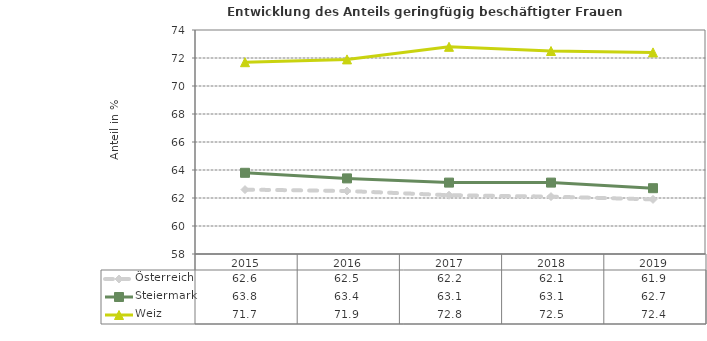
| Category | Österreich | Steiermark | Weiz |
|---|---|---|---|
| 2019.0 | 61.9 | 62.7 | 72.4 |
| 2018.0 | 62.1 | 63.1 | 72.5 |
| 2017.0 | 62.2 | 63.1 | 72.8 |
| 2016.0 | 62.5 | 63.4 | 71.9 |
| 2015.0 | 62.6 | 63.8 | 71.7 |